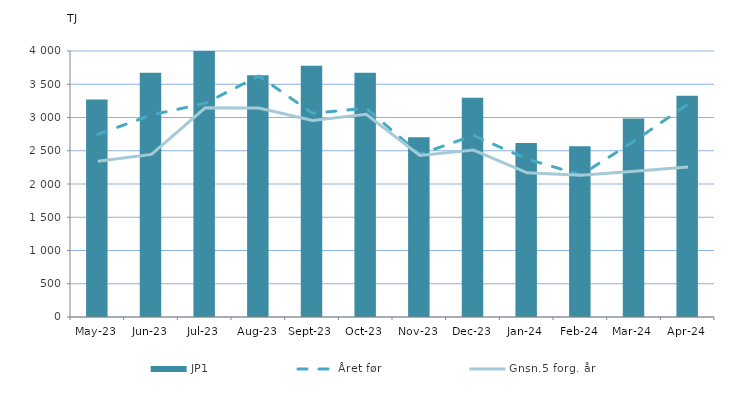
| Category | JP1 |
|---|---|
| 2023-05-01 | 3268.834 |
| 2023-06-01 | 3672.096 |
| 2023-07-01 | 4041.254 |
| 2023-08-01 | 3634.06 |
| 2023-09-01 | 3778.132 |
| 2023-10-01 | 3671.539 |
| 2023-11-01 | 2703.96 |
| 2023-12-01 | 3295.212 |
| 2024-01-01 | 2616.612 |
| 2024-02-01 | 2568.24 |
| 2024-03-01 | 2984.135 |
| 2024-04-01 | 3326.88 |